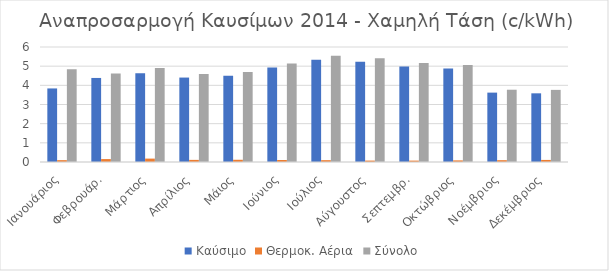
| Category | Καύσιμο | Θερμοκ. Αέρια | Σύνολο |
|---|---|---|---|
| Ιανουάριος | 3.838 | 0.096 | 4.838 |
| Φεβρουάρ. | 4.385 | 0.152 | 4.621 |
| Μάρτιος | 4.632 | 0.177 | 4.903 |
| Απρίλιος | 4.405 | 0.111 | 4.595 |
| Μάιος | 4.494 | 0.117 | 4.691 |
| Ιούνιος | 4.928 | 0.106 | 5.135 |
| Ιούλιος | 5.33 | 0.095 | 5.543 |
| Αύγουστος | 5.23 | 0.074 | 5.417 |
| Σεπτεμβρ. | 4.982 | 0.073 | 5.166 |
| Οκτώβριος | 4.873 | 0.084 | 5.065 |
| Νοέμβριος | 3.62 | 0.095 | 3.771 |
| Δεκέμβριος | 3.583 | 0.108 | 3.763 |